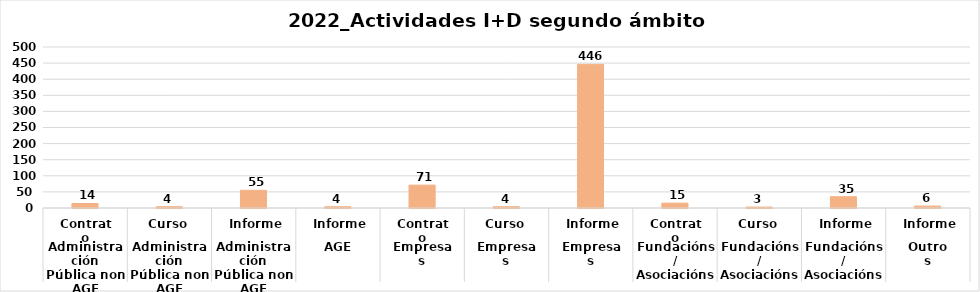
| Category | Series 0 |
|---|---|
| 0 | 14 |
| 1 | 4 |
| 2 | 55 |
| 3 | 4 |
| 4 | 71 |
| 5 | 4 |
| 6 | 446 |
| 7 | 15 |
| 8 | 3 |
| 9 | 35 |
| 10 | 6 |